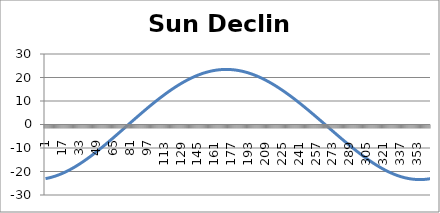
| Category | Sun Declin (deg) |
|---|---|
| 0 | -23.018 |
| 1 | -22.933 |
| 2 | -22.841 |
| 3 | -22.742 |
| 4 | -22.635 |
| 5 | -22.52 |
| 6 | -22.398 |
| 7 | -22.269 |
| 8 | -22.133 |
| 9 | -21.989 |
| 10 | -21.838 |
| 11 | -21.68 |
| 12 | -21.515 |
| 13 | -21.343 |
| 14 | -21.164 |
| 15 | -20.978 |
| 16 | -20.786 |
| 17 | -20.587 |
| 18 | -20.382 |
| 19 | -20.17 |
| 20 | -19.952 |
| 21 | -19.728 |
| 22 | -19.497 |
| 23 | -19.261 |
| 24 | -19.019 |
| 25 | -18.771 |
| 26 | -18.517 |
| 27 | -18.257 |
| 28 | -17.992 |
| 29 | -17.722 |
| 30 | -17.447 |
| 31 | -17.166 |
| 32 | -16.88 |
| 33 | -16.589 |
| 34 | -16.294 |
| 35 | -15.994 |
| 36 | -15.689 |
| 37 | -15.38 |
| 38 | -15.066 |
| 39 | -14.748 |
| 40 | -14.426 |
| 41 | -14.1 |
| 42 | -13.77 |
| 43 | -13.437 |
| 44 | -13.099 |
| 45 | -12.758 |
| 46 | -12.414 |
| 47 | -12.066 |
| 48 | -11.716 |
| 49 | -11.362 |
| 50 | -11.005 |
| 51 | -10.645 |
| 52 | -10.282 |
| 53 | -9.917 |
| 54 | -9.55 |
| 55 | -9.179 |
| 56 | -8.807 |
| 57 | -8.433 |
| 58 | -8.056 |
| 59 | -7.677 |
| 60 | -7.297 |
| 61 | -6.915 |
| 62 | -6.531 |
| 63 | -6.146 |
| 64 | -5.759 |
| 65 | -5.371 |
| 66 | -4.982 |
| 67 | -4.591 |
| 68 | -4.2 |
| 69 | -3.808 |
| 70 | -3.415 |
| 71 | -3.021 |
| 72 | -2.627 |
| 73 | -2.233 |
| 74 | -1.838 |
| 75 | -1.442 |
| 76 | -1.047 |
| 77 | -0.652 |
| 78 | -0.256 |
| 79 | 0.139 |
| 80 | 0.534 |
| 81 | 0.929 |
| 82 | 1.323 |
| 83 | 1.716 |
| 84 | 2.109 |
| 85 | 2.501 |
| 86 | 2.893 |
| 87 | 3.283 |
| 88 | 3.672 |
| 89 | 4.061 |
| 90 | 4.447 |
| 91 | 4.833 |
| 92 | 5.217 |
| 93 | 5.6 |
| 94 | 5.981 |
| 95 | 6.36 |
| 96 | 6.737 |
| 97 | 7.113 |
| 98 | 7.486 |
| 99 | 7.858 |
| 100 | 8.227 |
| 101 | 8.594 |
| 102 | 8.958 |
| 103 | 9.32 |
| 104 | 9.68 |
| 105 | 10.036 |
| 106 | 10.39 |
| 107 | 10.742 |
| 108 | 11.09 |
| 109 | 11.435 |
| 110 | 11.777 |
| 111 | 12.115 |
| 112 | 12.451 |
| 113 | 12.783 |
| 114 | 13.111 |
| 115 | 13.436 |
| 116 | 13.758 |
| 117 | 14.075 |
| 118 | 14.389 |
| 119 | 14.698 |
| 120 | 15.004 |
| 121 | 15.305 |
| 122 | 15.602 |
| 123 | 15.895 |
| 124 | 16.184 |
| 125 | 16.468 |
| 126 | 16.747 |
| 127 | 17.022 |
| 128 | 17.292 |
| 129 | 17.557 |
| 130 | 17.818 |
| 131 | 18.073 |
| 132 | 18.324 |
| 133 | 18.569 |
| 134 | 18.809 |
| 135 | 19.043 |
| 136 | 19.273 |
| 137 | 19.496 |
| 138 | 19.715 |
| 139 | 19.927 |
| 140 | 20.135 |
| 141 | 20.336 |
| 142 | 20.531 |
| 143 | 20.721 |
| 144 | 20.905 |
| 145 | 21.082 |
| 146 | 21.254 |
| 147 | 21.419 |
| 148 | 21.579 |
| 149 | 21.732 |
| 150 | 21.879 |
| 151 | 22.019 |
| 152 | 22.153 |
| 153 | 22.281 |
| 154 | 22.402 |
| 155 | 22.516 |
| 156 | 22.624 |
| 157 | 22.726 |
| 158 | 22.821 |
| 159 | 22.909 |
| 160 | 22.99 |
| 161 | 23.065 |
| 162 | 23.133 |
| 163 | 23.194 |
| 164 | 23.248 |
| 165 | 23.295 |
| 166 | 23.336 |
| 167 | 23.369 |
| 168 | 23.396 |
| 169 | 23.416 |
| 170 | 23.429 |
| 171 | 23.435 |
| 172 | 23.435 |
| 173 | 23.427 |
| 174 | 23.413 |
| 175 | 23.391 |
| 176 | 23.363 |
| 177 | 23.328 |
| 178 | 23.286 |
| 179 | 23.237 |
| 180 | 23.182 |
| 181 | 23.119 |
| 182 | 23.05 |
| 183 | 22.975 |
| 184 | 22.892 |
| 185 | 22.803 |
| 186 | 22.707 |
| 187 | 22.605 |
| 188 | 22.496 |
| 189 | 22.381 |
| 190 | 22.26 |
| 191 | 22.131 |
| 192 | 21.997 |
| 193 | 21.856 |
| 194 | 21.709 |
| 195 | 21.556 |
| 196 | 21.397 |
| 197 | 21.232 |
| 198 | 21.061 |
| 199 | 20.883 |
| 200 | 20.7 |
| 201 | 20.511 |
| 202 | 20.317 |
| 203 | 20.116 |
| 204 | 19.911 |
| 205 | 19.699 |
| 206 | 19.482 |
| 207 | 19.26 |
| 208 | 19.032 |
| 209 | 18.8 |
| 210 | 18.562 |
| 211 | 18.319 |
| 212 | 18.071 |
| 213 | 17.818 |
| 214 | 17.56 |
| 215 | 17.298 |
| 216 | 17.03 |
| 217 | 16.759 |
| 218 | 16.482 |
| 219 | 16.202 |
| 220 | 15.917 |
| 221 | 15.627 |
| 222 | 15.334 |
| 223 | 15.036 |
| 224 | 14.735 |
| 225 | 14.429 |
| 226 | 14.12 |
| 227 | 13.807 |
| 228 | 13.491 |
| 229 | 13.17 |
| 230 | 12.847 |
| 231 | 12.52 |
| 232 | 12.189 |
| 233 | 11.856 |
| 234 | 11.519 |
| 235 | 11.179 |
| 236 | 10.836 |
| 237 | 10.491 |
| 238 | 10.143 |
| 239 | 9.792 |
| 240 | 9.438 |
| 241 | 9.082 |
| 242 | 8.723 |
| 243 | 8.363 |
| 244 | 8 |
| 245 | 7.634 |
| 246 | 7.267 |
| 247 | 6.898 |
| 248 | 6.527 |
| 249 | 6.154 |
| 250 | 5.779 |
| 251 | 5.403 |
| 252 | 5.025 |
| 253 | 4.646 |
| 254 | 4.266 |
| 255 | 3.884 |
| 256 | 3.501 |
| 257 | 3.117 |
| 258 | 2.733 |
| 259 | 2.347 |
| 260 | 1.96 |
| 261 | 1.573 |
| 262 | 1.185 |
| 263 | 0.797 |
| 264 | 0.408 |
| 265 | 0.019 |
| 266 | -0.37 |
| 267 | -0.76 |
| 268 | -1.149 |
| 269 | -1.538 |
| 270 | -1.928 |
| 271 | -2.316 |
| 272 | -2.705 |
| 273 | -3.093 |
| 274 | -3.481 |
| 275 | -3.868 |
| 276 | -4.254 |
| 277 | -4.639 |
| 278 | -5.024 |
| 279 | -5.407 |
| 280 | -5.789 |
| 281 | -6.17 |
| 282 | -6.55 |
| 283 | -6.928 |
| 284 | -7.305 |
| 285 | -7.68 |
| 286 | -8.053 |
| 287 | -8.424 |
| 288 | -8.794 |
| 289 | -9.161 |
| 290 | -9.526 |
| 291 | -9.889 |
| 292 | -10.249 |
| 293 | -10.607 |
| 294 | -10.962 |
| 295 | -11.315 |
| 296 | -11.665 |
| 297 | -12.012 |
| 298 | -12.355 |
| 299 | -12.696 |
| 300 | -13.033 |
| 301 | -13.367 |
| 302 | -13.697 |
| 303 | -14.024 |
| 304 | -14.347 |
| 305 | -14.667 |
| 306 | -14.982 |
| 307 | -15.293 |
| 308 | -15.6 |
| 309 | -15.903 |
| 310 | -16.201 |
| 311 | -16.495 |
| 312 | -16.784 |
| 313 | -17.069 |
| 314 | -17.348 |
| 315 | -17.623 |
| 316 | -17.893 |
| 317 | -18.157 |
| 318 | -18.416 |
| 319 | -18.67 |
| 320 | -18.918 |
| 321 | -19.161 |
| 322 | -19.398 |
| 323 | -19.629 |
| 324 | -19.854 |
| 325 | -20.073 |
| 326 | -20.286 |
| 327 | -20.493 |
| 328 | -20.694 |
| 329 | -20.888 |
| 330 | -21.075 |
| 331 | -21.256 |
| 332 | -21.431 |
| 333 | -21.598 |
| 334 | -21.759 |
| 335 | -21.913 |
| 336 | -22.059 |
| 337 | -22.199 |
| 338 | -22.332 |
| 339 | -22.457 |
| 340 | -22.575 |
| 341 | -22.686 |
| 342 | -22.789 |
| 343 | -22.885 |
| 344 | -22.973 |
| 345 | -23.054 |
| 346 | -23.127 |
| 347 | -23.192 |
| 348 | -23.25 |
| 349 | -23.3 |
| 350 | -23.342 |
| 351 | -23.377 |
| 352 | -23.403 |
| 353 | -23.422 |
| 354 | -23.433 |
| 355 | -23.436 |
| 356 | -23.432 |
| 357 | -23.419 |
| 358 | -23.399 |
| 359 | -23.371 |
| 360 | -23.335 |
| 361 | -23.291 |
| 362 | -23.239 |
| 363 | -23.18 |
| 364 | -23.113 |
| 365 | -23.038 |